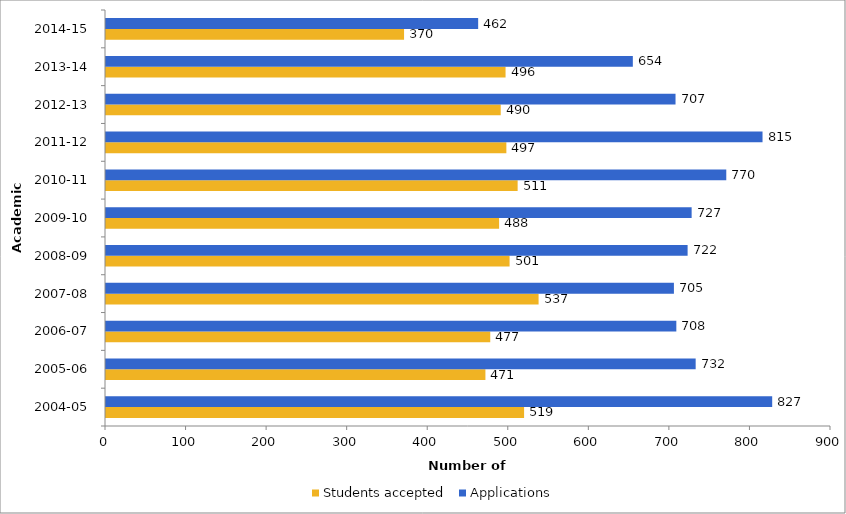
| Category | Students accepted | Applications |
|---|---|---|
| 2004-05 | 519 | 827 |
| 2005-06 | 471 | 732 |
| 2006-07 | 477 | 708 |
| 2007-08 | 537 | 705 |
| 2008-09 | 501 | 722 |
| 2009-10 | 488 | 727 |
| 2010-11 | 511 | 770 |
| 2011-12 | 497 | 815 |
| 2012-13 | 490 | 707 |
| 2013-14 | 496 | 654 |
| 2014-15 | 370 | 462 |